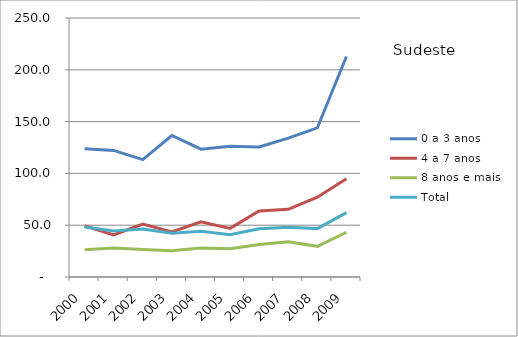
| Category | 0 a 3 anos | 4 a 7 anos | 8 anos e mais | Total |
|---|---|---|---|---|
| 2000.0 | 123.7 | 49.5 | 26.4 | 48.2 |
| 2001.0 | 122.2 | 40.7 | 28.1 | 44.3 |
| 2002.0 | 113.3 | 51 | 26.5 | 46.3 |
| 2003.0 | 136.6 | 43.4 | 25.4 | 42.2 |
| 2004.0 | 123.4 | 53.3 | 28 | 44.2 |
| 2005.0 | 126.2 | 46.9 | 27.2 | 40.7 |
| 2006.0 | 125.6 | 63.7 | 31.4 | 46.5 |
| 2007.0 | 134.1 | 65.3 | 34.1 | 48.1 |
| 2008.0 | 143.9 | 77 | 29.6 | 46.7 |
| 2009.0 | 212.8 | 94.9 | 43.2 | 62.1 |